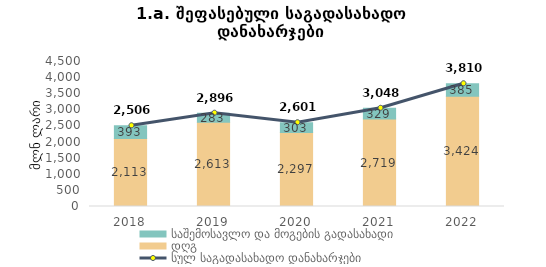
| Category | დღგ | საშემოსავლო და მოგების გადასახადი |
|---|---|---|
| 2018.0 | 2112.727 | 393.098 |
| 2019.0 | 2612.826 | 282.786 |
| 2020.0 | 2297.207 | 303.441 |
| 2021.0 | 2719.125 | 328.629 |
| 2022.0 | 3424.268 | 385.314 |